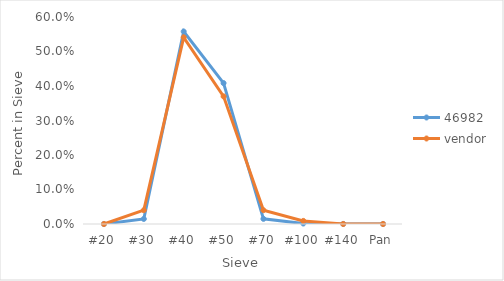
| Category | 46982 | vendor |
|---|---|---|
| #20 | 0 | 0 |
| #30 | 0.015 | 0.04 |
| #40 | 0.558 | 0.541 |
| #50 | 0.408 | 0.37 |
| #70 | 0.015 | 0.04 |
| #100 | 0.001 | 0.009 |
| #140 | 0 | 0 |
| Pan | 0 | 0 |